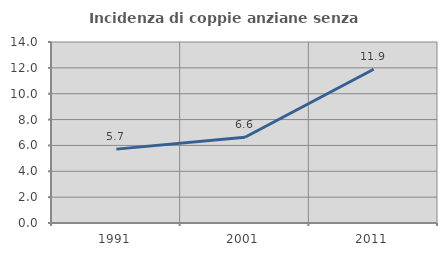
| Category | Incidenza di coppie anziane senza figli  |
|---|---|
| 1991.0 | 5.714 |
| 2001.0 | 6.633 |
| 2011.0 | 11.892 |